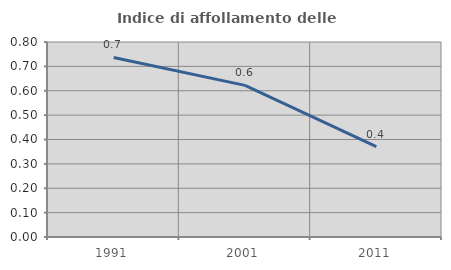
| Category | Indice di affollamento delle abitazioni  |
|---|---|
| 1991.0 | 0.737 |
| 2001.0 | 0.622 |
| 2011.0 | 0.371 |